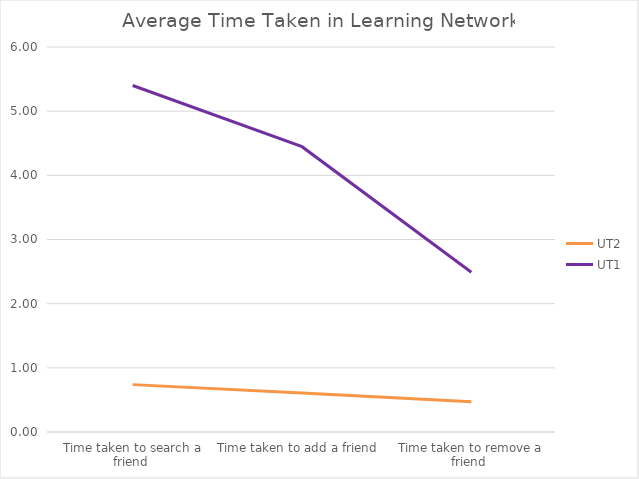
| Category | UT2 | UT1 |
|---|---|---|
| Time taken to search a friend  | 0.738 | 5.4 |
| Time taken to add a friend  | 0.607 | 4.447 |
| Time taken to remove a friend  | 0.472 | 2.489 |